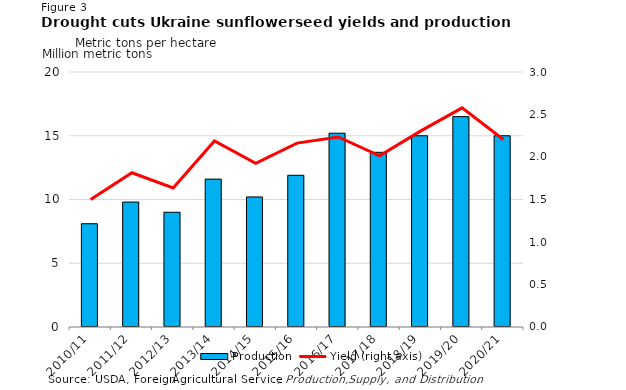
| Category | Production |
|---|---|
| 2010/11 | 8.1 |
| 2011/12 | 9.8 |
| 2012/13 | 9 |
| 2013/14 | 11.6 |
| 2014/15 | 10.2 |
| 2015/16 | 11.9 |
| 2016/17 | 15.2 |
| 2017/18 | 13.7 |
| 2018/19 | 15 |
| 2019/20 | 16.5 |
| 2020/21 | 15 |